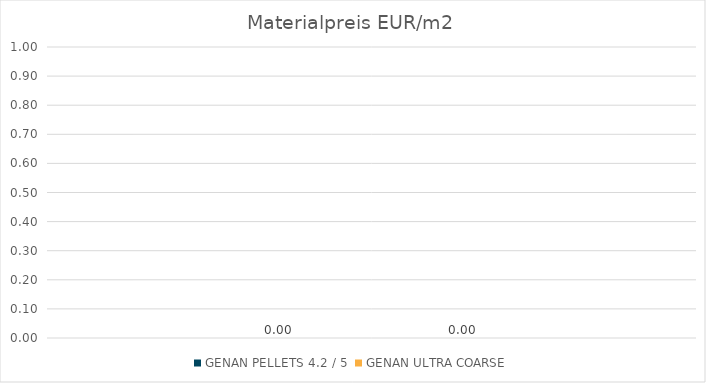
| Category | GENAN PELLETS 4.2 / 5 | GENAN ULTRA COARSE |
|---|---|---|
| 0 | 0 | 0 |